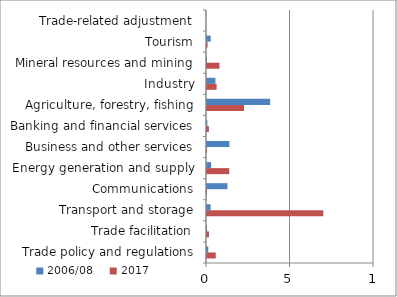
| Category | 2017 | 2006/08 |
|---|---|---|
| Trade policy and regulations | 0.524 | 0.076 |
| Trade facilitation | 0.116 | 0.002 |
| Transport and storage | 6.964 | 0.216 |
| Communications | 0.001 | 1.225 |
| Energy generation and supply | 1.33 | 0.245 |
| Business and other services | 0.001 | 1.343 |
| Banking and financial services | 0.112 | 0.021 |
| Agriculture, forestry, fishing | 2.217 | 3.782 |
| Industry | 0.576 | 0.503 |
| Mineral resources and mining | 0.747 | 0 |
| Tourism | 0.035 | 0.222 |
| Trade-related adjustment | 0 | 0 |